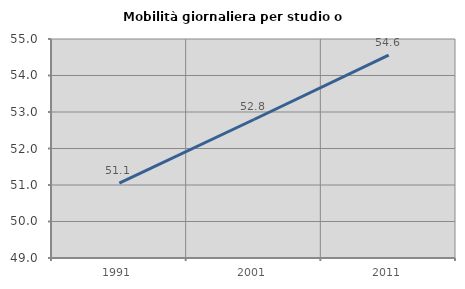
| Category | Mobilità giornaliera per studio o lavoro |
|---|---|
| 1991.0 | 51.053 |
| 2001.0 | 52.795 |
| 2011.0 | 54.56 |